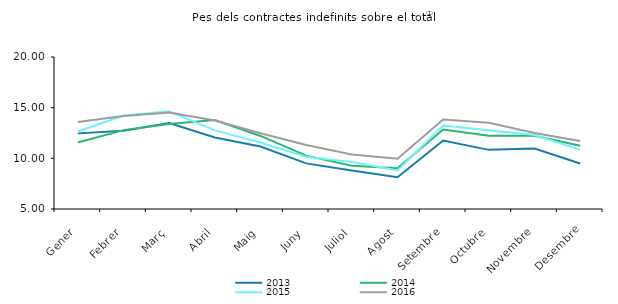
| Category | 2013 | 2014 | 2015 | 2016 |
|---|---|---|---|---|
| Gener | 12.463 | 11.558 | 12.648 | 13.583 |
| Febrer | 12.731 | 12.785 | 14.217 | 14.183 |
| Març | 13.482 | 13.382 | 14.648 | 14.534 |
| Abril | 12.062 | 13.786 | 12.755 | 13.742 |
| Maig | 11.164 | 12.21 | 11.561 | 12.469 |
| Juny | 9.501 | 10.268 | 10.162 | 11.317 |
| Juliol | 8.806 | 9.277 | 9.65 | 10.375 |
| Agost | 8.142 | 9.015 | 8.797 | 9.962 |
| Setembre | 11.751 | 12.837 | 13.241 | 13.823 |
| Octubre | 10.835 | 12.239 | 12.777 | 13.518 |
| Novembre | 10.967 | 12.219 | 12.295 | 12.499 |
| Desembre | 9.486 | 11.235 | 10.861 | 11.702 |